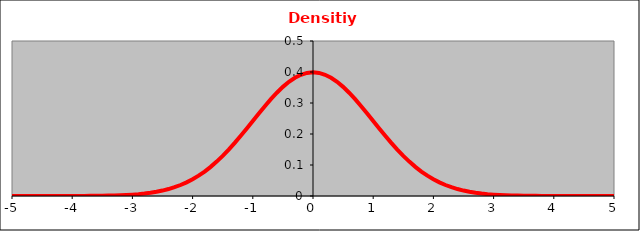
| Category | density function |
|---|---|
| -10.0 | 0 |
| -9.9 | 0 |
| -9.8 | 0 |
| -9.7 | 0 |
| -9.6 | 0 |
| -9.5 | 0 |
| -9.4 | 0 |
| -9.3 | 0 |
| -9.2 | 0 |
| -9.1 | 0 |
| -9.0 | 0 |
| -8.9 | 0 |
| -8.8 | 0 |
| -8.7 | 0 |
| -8.6 | 0 |
| -8.5 | 0 |
| -8.40000000000001 | 0 |
| -8.30000000000001 | 0 |
| -8.20000000000001 | 0 |
| -8.10000000000001 | 0 |
| -8.00000000000001 | 0 |
| -7.90000000000001 | 0 |
| -7.80000000000001 | 0 |
| -7.70000000000001 | 0 |
| -7.60000000000001 | 0 |
| -7.50000000000001 | 0 |
| -7.40000000000001 | 0 |
| -7.30000000000001 | 0 |
| -7.20000000000001 | 0 |
| -7.10000000000001 | 0 |
| -7.00000000000001 | 0 |
| -6.90000000000001 | 0 |
| -6.80000000000001 | 0 |
| -6.70000000000001 | 0 |
| -6.60000000000001 | 0 |
| -6.50000000000001 | 0 |
| -6.40000000000001 | 0 |
| -6.30000000000001 | 0 |
| -6.20000000000001 | 0 |
| -6.10000000000001 | 0 |
| -6.00000000000001 | 0 |
| -5.90000000000001 | 0 |
| -5.80000000000001 | 0 |
| -5.70000000000001 | 0 |
| -5.60000000000002 | 0 |
| -5.50000000000002 | 0 |
| -5.40000000000002 | 0 |
| -5.30000000000002 | 0 |
| -5.20000000000002 | 0 |
| -5.10000000000002 | 0 |
| -5.00000000000002 | 0 |
| -4.90000000000002 | 0 |
| -4.80000000000002 | 0 |
| -4.70000000000002 | 0 |
| -4.60000000000002 | 0 |
| -4.50000000000002 | 0 |
| -4.40000000000002 | 0 |
| -4.30000000000002 | 0 |
| -4.20000000000002 | 0 |
| -4.10000000000002 | 0 |
| -4.00000000000002 | 0 |
| -3.90000000000002 | 0 |
| -3.80000000000002 | 0 |
| -3.70000000000002 | 0 |
| -3.60000000000002 | 0.001 |
| -3.50000000000002 | 0.001 |
| -3.40000000000002 | 0.001 |
| -3.30000000000002 | 0.002 |
| -3.20000000000002 | 0.002 |
| -3.10000000000002 | 0.003 |
| -3.00000000000002 | 0.004 |
| -2.90000000000002 | 0.006 |
| -2.80000000000003 | 0.008 |
| -2.70000000000003 | 0.01 |
| -2.60000000000003 | 0.014 |
| -2.50000000000003 | 0.018 |
| -2.40000000000003 | 0.022 |
| -2.30000000000003 | 0.028 |
| -2.20000000000003 | 0.035 |
| -2.10000000000003 | 0.044 |
| -2.00000000000003 | 0.054 |
| -1.90000000000003 | 0.066 |
| -1.80000000000003 | 0.079 |
| -1.70000000000003 | 0.094 |
| -1.60000000000003 | 0.111 |
| -1.50000000000003 | 0.13 |
| -1.40000000000003 | 0.15 |
| -1.30000000000003 | 0.171 |
| -1.20000000000003 | 0.194 |
| -1.10000000000003 | 0.218 |
| -1.00000000000003 | 0.242 |
| -0.900000000000031 | 0.266 |
| -0.800000000000031 | 0.29 |
| -0.700000000000029 | 0.312 |
| -0.60000000000003 | 0.333 |
| -0.50000000000003 | 0.352 |
| -0.400000000000031 | 0.368 |
| -0.300000000000031 | 0.381 |
| -0.200000000000029 | 0.391 |
| -0.10000000000003 | 0.397 |
| -4.08562073062058e-14 | 0.399 |
| 0.0999999999999588 | 0.397 |
| 0.199999999999999 | 0.391 |
| 0.299999999999999 | 0.381 |
| 0.4 | 0.368 |
| 0.5 | 0.352 |
| 0.6 | 0.333 |
| 0.699999999999999 | 0.312 |
| 0.799999999999999 | 0.29 |
| 0.9 | 0.266 |
| 1.0 | 0.242 |
| 1.1 | 0.218 |
| 1.2 | 0.194 |
| 1.3 | 0.171 |
| 1.4 | 0.15 |
| 1.5 | 0.13 |
| 1.6 | 0.111 |
| 1.7 | 0.094 |
| 1.8 | 0.079 |
| 1.9 | 0.066 |
| 2.0 | 0.054 |
| 2.1 | 0.044 |
| 2.2 | 0.035 |
| 2.3 | 0.028 |
| 2.4 | 0.022 |
| 2.5 | 0.018 |
| 2.6 | 0.014 |
| 2.7 | 0.01 |
| 2.8 | 0.008 |
| 2.9 | 0.006 |
| 3.0 | 0.004 |
| 3.1 | 0.003 |
| 3.2 | 0.002 |
| 3.3 | 0.002 |
| 3.4 | 0.001 |
| 3.5 | 0.001 |
| 3.6 | 0.001 |
| 3.7 | 0 |
| 3.8 | 0 |
| 3.9 | 0 |
| 4.0 | 0 |
| 4.1 | 0 |
| 4.1999999999999 | 0 |
| 4.2999999999999 | 0 |
| 4.3999999999999 | 0 |
| 4.4999999999999 | 0 |
| 4.5999999999999 | 0 |
| 4.6999999999999 | 0 |
| 4.7999999999999 | 0 |
| 4.8999999999999 | 0 |
| 4.9999999999999 | 0 |
| 5.0999999999999 | 0 |
| 5.1999999999999 | 0 |
| 5.2999999999999 | 0 |
| 5.3999999999999 | 0 |
| 5.4999999999999 | 0 |
| 5.5999999999999 | 0 |
| 5.6999999999999 | 0 |
| 5.7999999999999 | 0 |
| 5.8999999999999 | 0 |
| 5.9999999999999 | 0 |
| 6.0999999999999 | 0 |
| 6.1999999999999 | 0 |
| 6.2999999999999 | 0 |
| 6.3999999999999 | 0 |
| 6.4999999999999 | 0 |
| 6.5999999999999 | 0 |
| 6.6999999999999 | 0 |
| 6.7999999999999 | 0 |
| 6.8999999999999 | 0 |
| 6.9999999999999 | 0 |
| 7.0999999999999 | 0 |
| 7.1999999999999 | 0 |
| 7.2999999999999 | 0 |
| 7.3999999999999 | 0 |
| 7.4999999999999 | 0 |
| 7.5999999999999 | 0 |
| 7.6999999999999 | 0 |
| 7.7999999999999 | 0 |
| 7.8999999999999 | 0 |
| 7.9999999999999 | 0 |
| 8.0999999999999 | 0 |
| 8.1999999999999 | 0 |
| 8.2999999999999 | 0 |
| 8.3999999999999 | 0 |
| 8.4999999999999 | 0 |
| 8.5999999999999 | 0 |
| 8.6999999999999 | 0 |
| 8.7999999999999 | 0 |
| 8.8999999999999 | 0 |
| 8.9999999999999 | 0 |
| 9.0999999999999 | 0 |
| 9.1999999999999 | 0 |
| 9.2999999999999 | 0 |
| 9.3999999999999 | 0 |
| 9.4999999999999 | 0 |
| 9.5999999999999 | 0 |
| 9.6999999999999 | 0 |
| 9.7999999999999 | 0 |
| 9.8999999999999 | 0 |
| 9.9999999999999 | 0 |